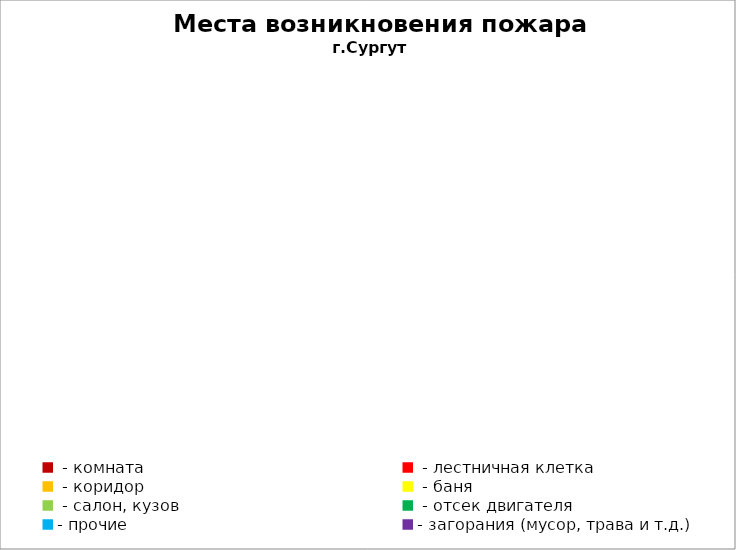
| Category | Места возникновения пожара |
|---|---|
|  - комната | 16 |
|  - лестничная клетка | 2 |
|  - коридор | 5 |
|  - баня | 3 |
|  - салон, кузов | 6 |
|  - отсек двигателя | 20 |
| - прочие | 55 |
| - загорания (мусор, трава и т.д.)  | 21 |